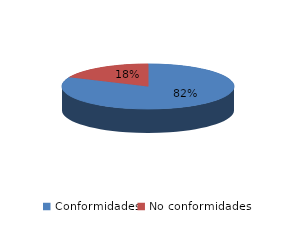
| Category | Series 0 |
|---|---|
| Conformidades | 2090 |
| No conformidades | 469 |